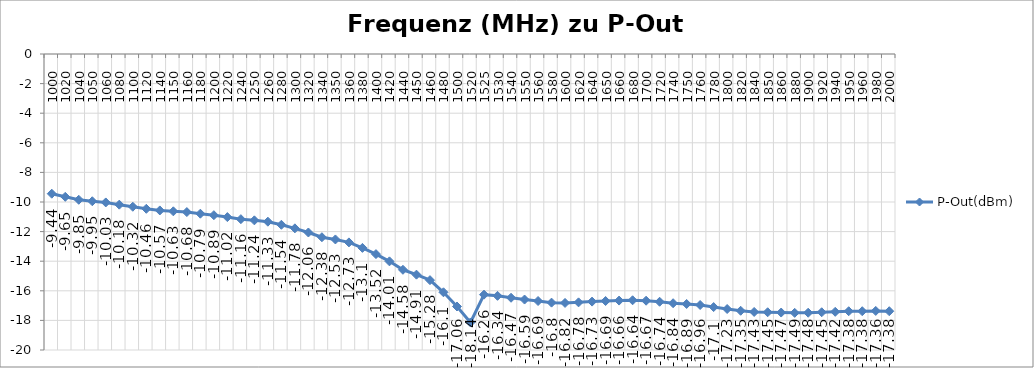
| Category | P-Out(dBm) |
|---|---|
| 1000.0 | -9.44 |
| 1020.0 | -9.65 |
| 1040.0 | -9.85 |
| 1050.0 | -9.95 |
| 1060.0 | -10.03 |
| 1080.0 | -10.18 |
| 1100.0 | -10.32 |
| 1120.0 | -10.46 |
| 1140.0 | -10.57 |
| 1150.0 | -10.63 |
| 1160.0 | -10.68 |
| 1180.0 | -10.79 |
| 1200.0 | -10.89 |
| 1220.0 | -11.02 |
| 1240.0 | -11.16 |
| 1250.0 | -11.24 |
| 1260.0 | -11.33 |
| 1280.0 | -11.54 |
| 1300.0 | -11.78 |
| 1320.0 | -12.06 |
| 1340.0 | -12.38 |
| 1350.0 | -12.53 |
| 1360.0 | -12.73 |
| 1380.0 | -13.1 |
| 1400.0 | -13.52 |
| 1420.0 | -14.01 |
| 1440.0 | -14.58 |
| 1450.0 | -14.91 |
| 1460.0 | -15.28 |
| 1480.0 | -16.1 |
| 1500.0 | -17.06 |
| 1520.0 | -18.14 |
| 1525.0 | -16.26 |
| 1530.0 | -16.34 |
| 1540.0 | -16.47 |
| 1550.0 | -16.59 |
| 1560.0 | -16.69 |
| 1580.0 | -16.8 |
| 1600.0 | -16.82 |
| 1620.0 | -16.78 |
| 1640.0 | -16.73 |
| 1650.0 | -16.69 |
| 1660.0 | -16.66 |
| 1680.0 | -16.64 |
| 1700.0 | -16.67 |
| 1720.0 | -16.74 |
| 1740.0 | -16.84 |
| 1750.0 | -16.89 |
| 1760.0 | -16.96 |
| 1780.0 | -17.1 |
| 1800.0 | -17.23 |
| 1820.0 | -17.35 |
| 1840.0 | -17.43 |
| 1850.0 | -17.45 |
| 1860.0 | -17.47 |
| 1880.0 | -17.49 |
| 1900.0 | -17.48 |
| 1920.0 | -17.45 |
| 1940.0 | -17.42 |
| 1950.0 | -17.38 |
| 1960.0 | -17.38 |
| 1980.0 | -17.36 |
| 2000.0 | -17.38 |